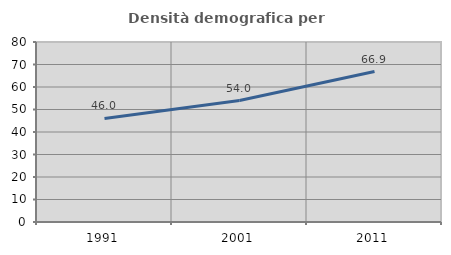
| Category | Densità demografica |
|---|---|
| 1991.0 | 46.034 |
| 2001.0 | 53.99 |
| 2011.0 | 66.854 |